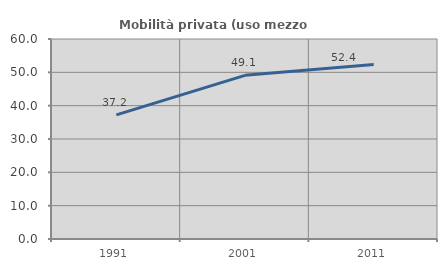
| Category | Mobilità privata (uso mezzo privato) |
|---|---|
| 1991.0 | 37.245 |
| 2001.0 | 49.089 |
| 2011.0 | 52.369 |